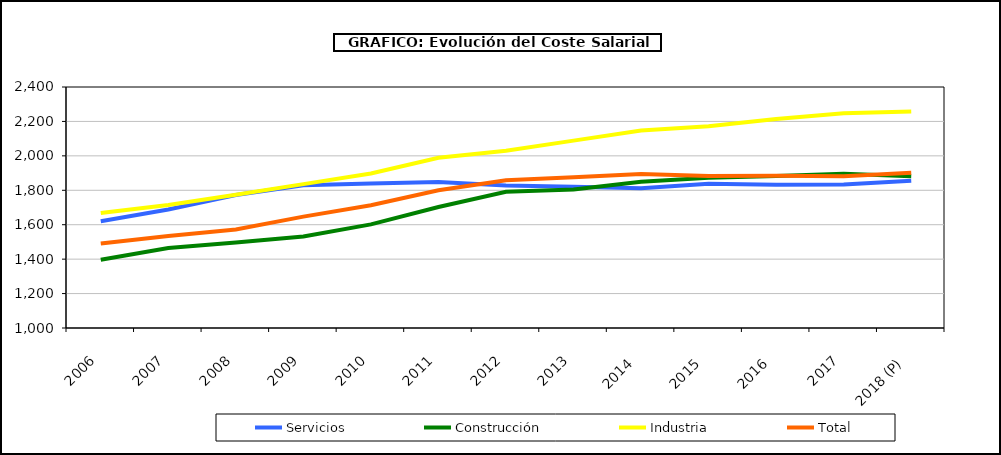
| Category | Servicios | Construcción | Industria | Total |
|---|---|---|---|---|
|  2006 | 1620.663 |  |  |  |
|  2007 | 1688.575 |  |  |  |
|  2008 | 1772.287 |  |  |  |
|  2009 | 1829.705 |  |  |  |
|  2010 | 1838.733 |  |  |  |
|  2011 | 1848.135 |  |  |  |
|  2012 | 1827.48 |  |  |  |
|  2013 | 1820.003 |  |  |  |
|  2014  | 1811.798 |  |  |  |
|  2015  | 1837.24 |  |  |  |
|  2016  | 1832.053 |  |  |  |
|  2017 | 1834.253 |  |  |  |
|  2018 (P)  | 1855.957 |  |  |  |